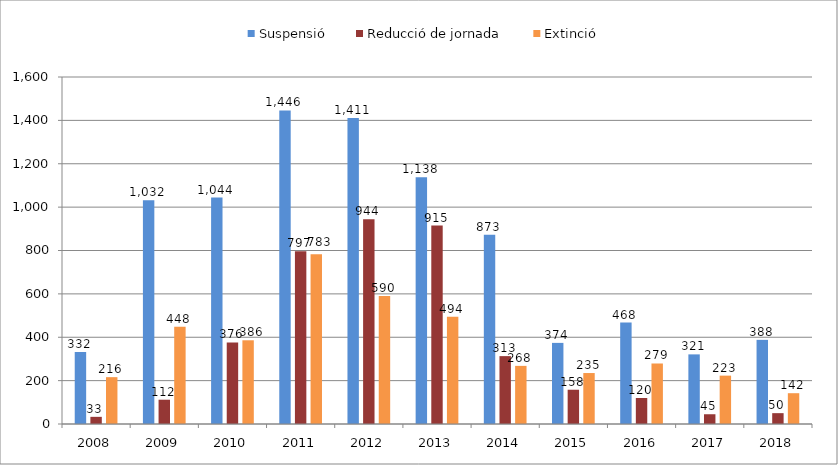
| Category | Suspensió | Reducció de jornada | Extinció |
|---|---|---|---|
| 2008.0 | 332 | 33 | 216 |
| 2009.0 | 1032 | 112 | 448 |
| 2010.0 | 1044 | 376 | 386 |
| 2011.0 | 1446 | 797 | 783 |
| 2012.0 | 1411 | 944 | 590 |
| 2013.0 | 1138 | 915 | 494 |
| 2014.0 | 873 | 313 | 268 |
| 2015.0 | 374 | 158 | 235 |
| 2016.0 | 468 | 120 | 279 |
| 2017.0 | 321 | 45 | 223 |
| 2018.0 | 388 | 50 | 142 |